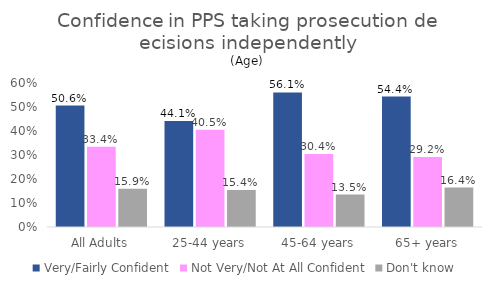
| Category | Very/Fairly Confident | Not Very/Not At All Confident | Don't know |
|---|---|---|---|
| All Adults | 0.506 | 0.334 | 0.159 |
| 25-44 years | 0.441 | 0.405 | 0.154 |
| 45-64 years | 0.561 | 0.304 | 0.135 |
| 65+ years | 0.544 | 0.292 | 0.164 |